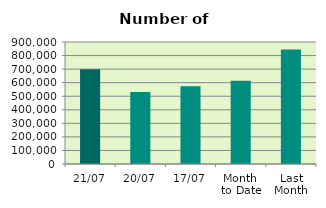
| Category | Series 0 |
|---|---|
| 21/07 | 698948 |
| 20/07 | 530466 |
| 17/07 | 572876 |
| Month 
to Date | 613453.733 |
| Last
Month | 844726.818 |